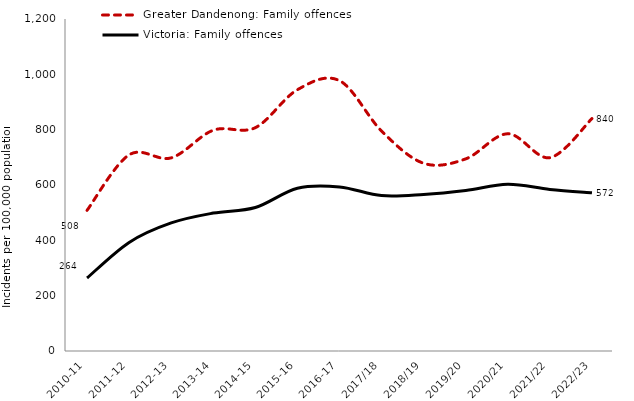
| Category | Greater Dandenong: Family offences | Victoria: Family offences |
|---|---|---|
| 2010-11 | 508.354 | 263.824 |
| 2011-12 | 709.021 | 392.482 |
| 2012-13 | 698.092 | 463.008 |
| 2013-14 | 798.081 | 498.535 |
| 2014-15 | 807.261 | 518.585 |
| 2015-16 | 944.427 | 588.174 |
| 2016-17 | 977.192 | 592.935 |
| 2017/18 | 795.014 | 561.657 |
| 2018/19 | 678.531 | 565.978 |
| 2019/20 | 694.407 | 580.379 |
| 2020/21 | 785.213 | 602.747 |
| 2021/22 | 698.86 | 583.887 |
| 2022/23 | 840.141 | 571.87 |